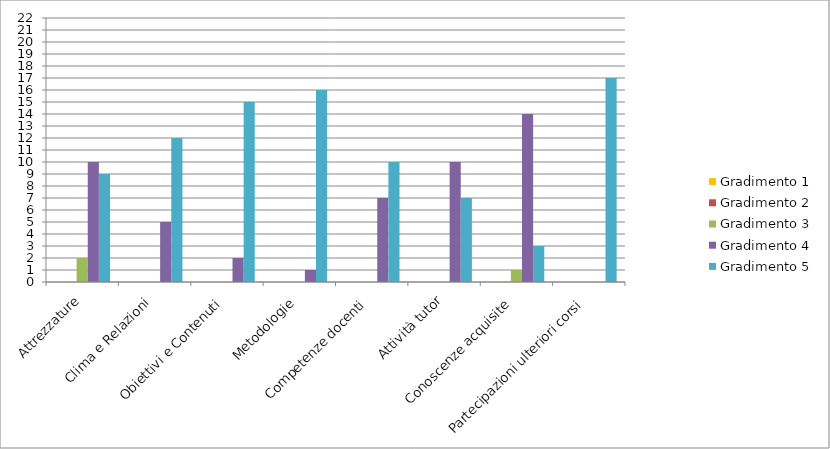
| Category | Gradimento 1 | Gradimento 2 | Gradimento 3 | Gradimento 4 | Gradimento 5 |
|---|---|---|---|---|---|
| Attrezzature | 0 | 0 | 2 | 10 | 9 |
| Clima e Relazioni  | 0 | 0 | 0 | 5 | 12 |
| Obiettivi e Contenuti | 0 | 0 | 0 | 2 | 15 |
| Metodologie | 0 | 0 | 0 | 1 | 16 |
| Competenze docenti | 0 | 0 | 0 | 7 | 10 |
| Attività tutor | 0 | 0 | 0 | 10 | 7 |
| Conoscenze acquisite | 0 | 0 | 1 | 14 | 3 |
| Partecipazioni ulteriori corsi | 0 | 0 | 0 | 0 | 17 |